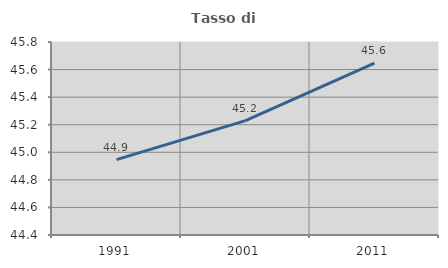
| Category | Tasso di occupazione   |
|---|---|
| 1991.0 | 44.947 |
| 2001.0 | 45.229 |
| 2011.0 | 45.646 |